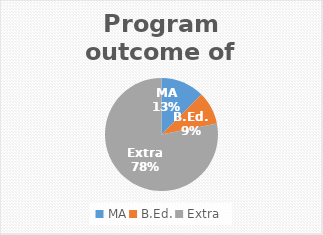
| Category | Series 0 |
|---|---|
| MA | 4 |
| B.Ed. | 3 |
| Extra | 25 |